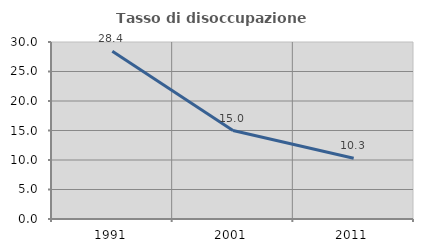
| Category | Tasso di disoccupazione giovanile  |
|---|---|
| 1991.0 | 28.44 |
| 2001.0 | 15 |
| 2011.0 | 10.286 |